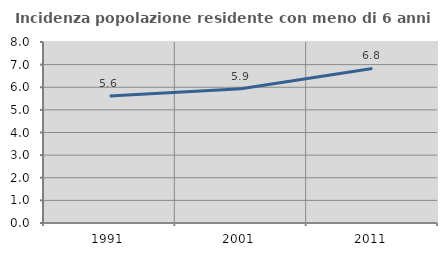
| Category | Incidenza popolazione residente con meno di 6 anni |
|---|---|
| 1991.0 | 5.61 |
| 2001.0 | 5.933 |
| 2011.0 | 6.831 |